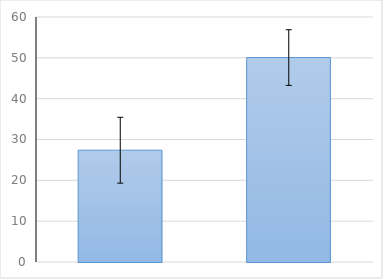
| Category | Series 0 |
|---|---|
| 0 | 27.377 |
| 1 | 50.069 |